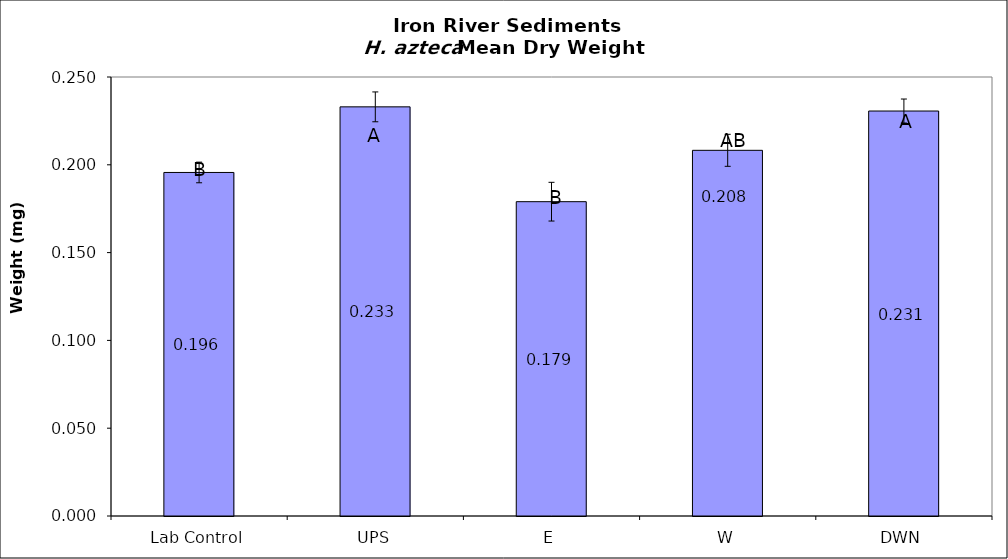
| Category | Series 0 |
|---|---|
| Lab Control | 0.196 |
| UPS | 0.233 |
| E | 0.179 |
| W | 0.208 |
| DWN | 0.231 |